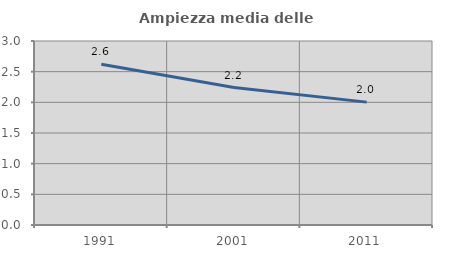
| Category | Ampiezza media delle famiglie |
|---|---|
| 1991.0 | 2.622 |
| 2001.0 | 2.24 |
| 2011.0 | 2.004 |